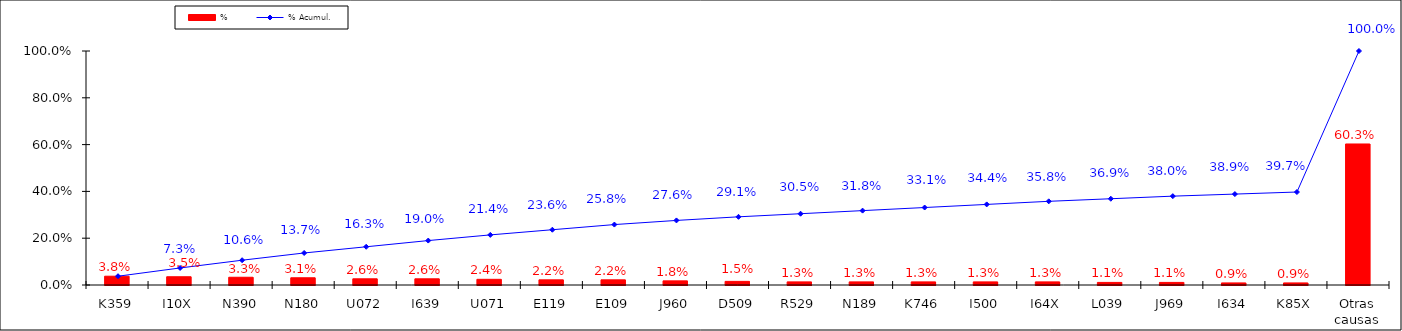
| Category | % |
|---|---|
| K359 | 0.038 |
| I10X | 0.035 |
| N390 | 0.033 |
| N180 | 0.031 |
| U072 | 0.026 |
| I639 | 0.026 |
| U071 | 0.024 |
| E119 | 0.022 |
| E109 | 0.022 |
| J960 | 0.018 |
| D509 | 0.015 |
| R529 | 0.013 |
| N189 | 0.013 |
| K746 | 0.013 |
| I500 | 0.013 |
| I64X | 0.013 |
| L039 | 0.011 |
| J969 | 0.011 |
| I634 | 0.009 |
| K85X | 0.009 |
| Otras causas | 0.603 |